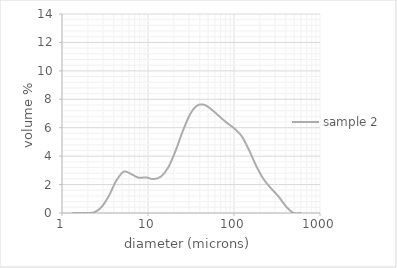
| Category | sample 2 |
|---|---|
| 1.32 | 0 |
| 1.6 | 0 |
| 1.95 | 0 |
| 2.38 | 0.054 |
| 2.9 | 0.437 |
| 3.53 | 1.238 |
| 4.3 | 2.295 |
| 5.24 | 2.912 |
| 6.39 | 2.734 |
| 7.78 | 2.484 |
| 9.48 | 2.501 |
| 11.55 | 2.386 |
| 14.08 | 2.552 |
| 17.15 | 3.196 |
| 20.9 | 4.367 |
| 25.46 | 5.785 |
| 31.01 | 6.969 |
| 37.79 | 7.577 |
| 46.03 | 7.594 |
| 56.09 | 7.234 |
| 68.33 | 6.769 |
| 83.26 | 6.33 |
| 101.44 | 5.931 |
| 123.59 | 5.383 |
| 150.57001 | 4.39 |
| 183.44 | 3.25 |
| 223.50999 | 2.335 |
| 272.31 | 1.706 |
| 331.76999 | 1.139 |
| 404.20999 | 0.451 |
| 492.47 | 0 |
| 600.0 | 0 |